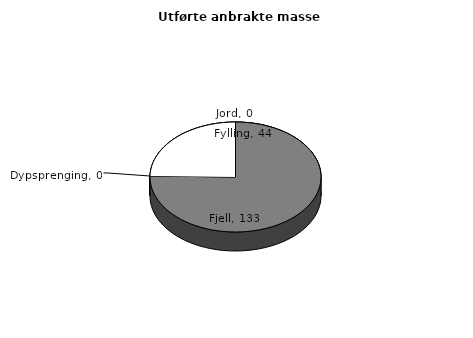
| Category | Jord |
|---|---|
| Jord | 0 |
| Fjell | 132.917 |
| Dypsprenging | 0 |
| Fylling | 43.635 |